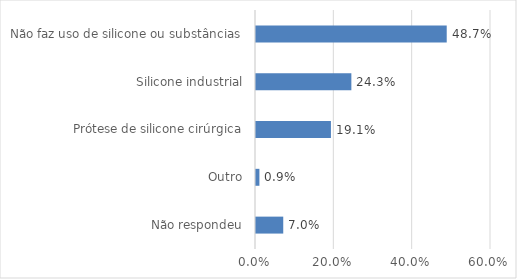
| Category | Series 0 |
|---|---|
| Não respondeu | 0.07 |
| Outro | 0.009 |
| Prótese de silicone cirúrgica | 0.191 |
| Silicone industrial | 0.243 |
| Não faz uso de silicone ou substâncias | 0.487 |